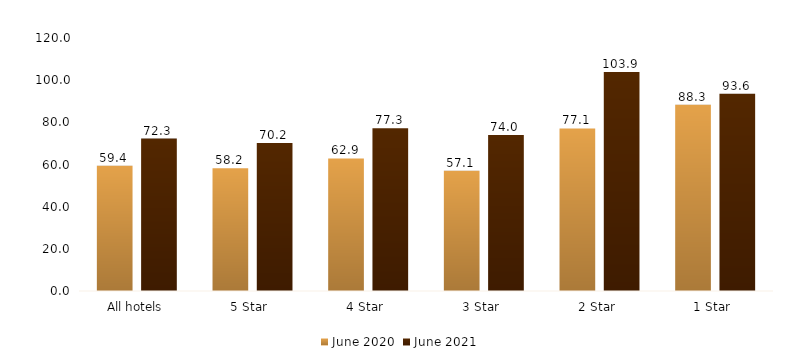
| Category | June 2020 | June 2021 |
|---|---|---|
| All hotels | 59.434 | 72.318 |
| 5 Star  | 58.181 | 70.169 |
| 4 Star  | 62.868 | 77.251 |
| 3 Star  | 57.066 | 74.002 |
| 2 Star  | 77.075 | 103.856 |
| 1 Star  | 88.324 | 93.588 |